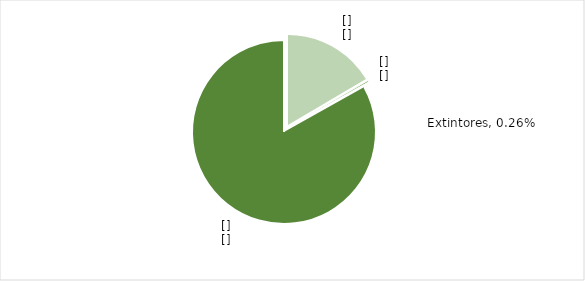
| Category | Series 1 |
|---|---|
| Fuentes fijas | 0.165 |
| Otros Consumos | 0.001 |
| Extintores | 0.003 |
| Gases refrigerantes | 0.831 |